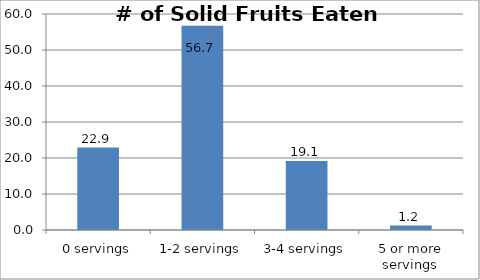
| Category | Series 0 |
|---|---|
| 0 servings | 22.887 |
| 1-2 servings | 56.729 |
| 3-4 servings | 19.148 |
| 5 or more servings | 1.235 |